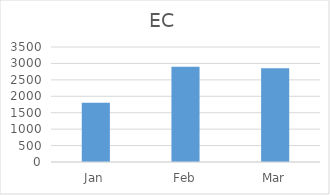
| Category | EC |
|---|---|
| Jan | 1800 |
| Feb | 2900 |
| Mar | 2850 |